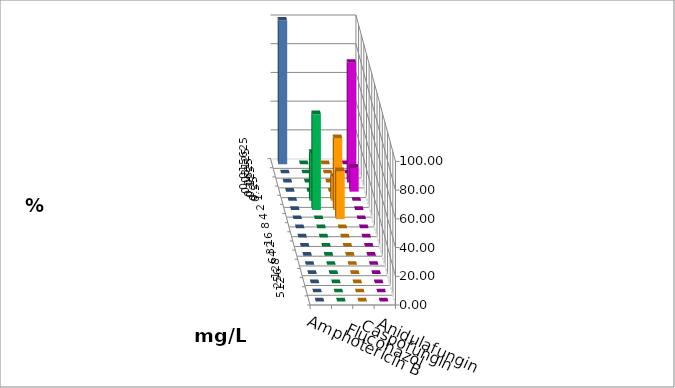
| Category | Amphotericin B | Fluconazol | Caspofungin | Anidulafungin |
|---|---|---|---|---|
| 0.015625 | 0 | 0 | 0 | 100 |
| 0.03125 | 0 | 0 | 0 | 0 |
| 0.0625 | 0 | 0 | 83.333 | 0 |
| 0.125 | 0 | 0 | 16.667 | 0 |
| 0.25 | 33.333 | 16.667 | 0 | 0 |
| 0.5 | 66.667 | 50 | 0 | 0 |
| 1.0 | 0 | 33.333 | 0 | 0 |
| 2.0 | 0 | 0 | 0 | 0 |
| 4.0 | 0 | 0 | 0 | 0 |
| 8.0 | 0 | 0 | 0 | 0 |
| 16.0 | 0 | 0 | 0 | 0 |
| 32.0 | 0 | 0 | 0 | 0 |
| 64.0 | 0 | 0 | 0 | 0 |
| 128.0 | 0 | 0 | 0 | 0 |
| 256.0 | 0 | 0 | 0 | 0 |
| 512.0 | 0 | 0 | 0 | 0 |